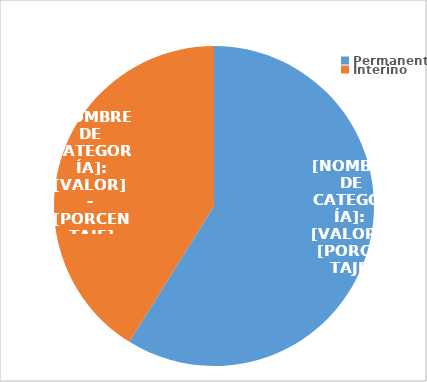
| Category | Series 0 |
|---|---|
| Permanente | 3271 |
| Interino | 2285 |